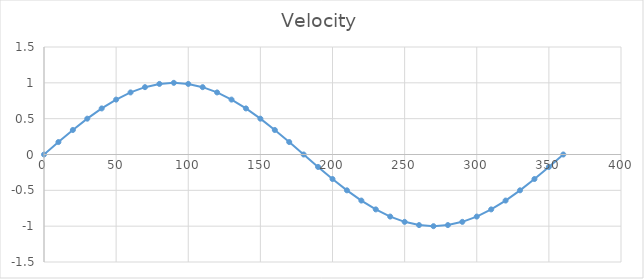
| Category | Series 0 |
|---|---|
| 0.0 | 0 |
| 10.0 | 0.174 |
| 20.0 | 0.342 |
| 30.0 | 0.5 |
| 40.0 | 0.643 |
| 50.0 | 0.766 |
| 60.0 | 0.866 |
| 70.0 | 0.94 |
| 80.0 | 0.985 |
| 90.0 | 1 |
| 100.0 | 0.985 |
| 110.0 | 0.94 |
| 120.0 | 0.866 |
| 130.0 | 0.766 |
| 140.0 | 0.643 |
| 150.0 | 0.5 |
| 160.0 | 0.342 |
| 170.0 | 0.174 |
| 180.0 | 0 |
| 190.0 | -0.174 |
| 200.0 | -0.342 |
| 210.0 | -0.5 |
| 220.0 | -0.643 |
| 230.0 | -0.766 |
| 240.0 | -0.866 |
| 250.0 | -0.94 |
| 260.0 | -0.985 |
| 270.0 | -1 |
| 280.0 | -0.985 |
| 290.0 | -0.94 |
| 300.0 | -0.866 |
| 310.0 | -0.766 |
| 320.0 | -0.643 |
| 330.0 | -0.5 |
| 340.0 | -0.342 |
| 350.0 | -0.174 |
| 360.0 | 0 |